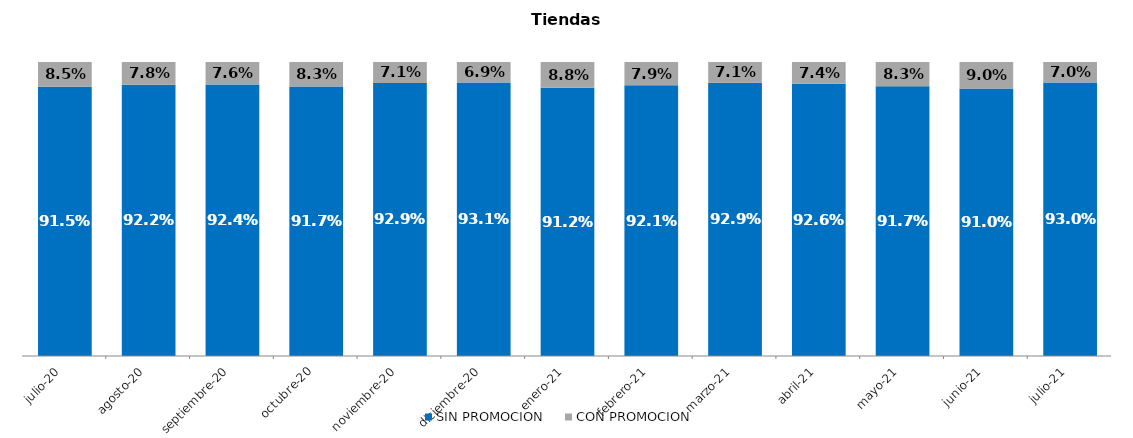
| Category | SIN PROMOCION   | CON PROMOCION   |
|---|---|---|
| 2020-07-01 | 0.915 | 0.085 |
| 2020-08-01 | 0.922 | 0.078 |
| 2020-09-01 | 0.924 | 0.076 |
| 2020-10-01 | 0.917 | 0.083 |
| 2020-11-01 | 0.929 | 0.071 |
| 2020-12-01 | 0.931 | 0.069 |
| 2021-01-01 | 0.912 | 0.088 |
| 2021-02-01 | 0.921 | 0.079 |
| 2021-03-01 | 0.929 | 0.071 |
| 2021-04-01 | 0.926 | 0.074 |
| 2021-05-01 | 0.917 | 0.083 |
| 2021-06-01 | 0.91 | 0.09 |
| 2021-07-01 | 0.93 | 0.07 |